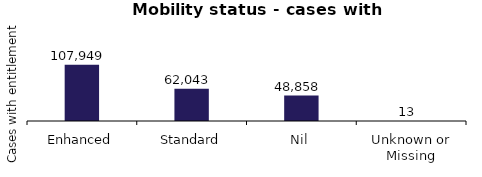
| Category | Number with Entitlement |
|---|---|
| Enhanced | 107949 |
| Standard | 62043 |
| Nil | 48858 |
| Unknown or Missing | 13 |